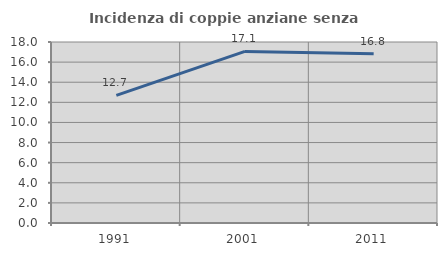
| Category | Incidenza di coppie anziane senza figli  |
|---|---|
| 1991.0 | 12.698 |
| 2001.0 | 17.068 |
| 2011.0 | 16.83 |